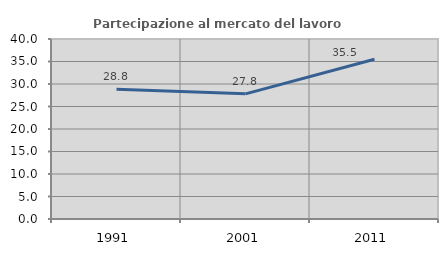
| Category | Partecipazione al mercato del lavoro  femminile |
|---|---|
| 1991.0 | 28.848 |
| 2001.0 | 27.815 |
| 2011.0 | 35.496 |